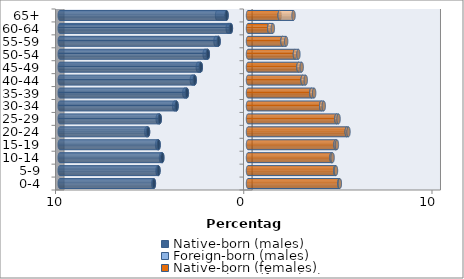
| Category | Native-born (males) | Foreign-born (males) | Native-born (females) | Foreign-born (females) |
|---|---|---|---|---|
| 0-4 | -4.999 | -0.032 | 4.853 | 0.024 |
| 5-9 | -4.756 | -0.05 | 4.635 | 0.04 |
| 10-14 | -4.552 | -0.067 | 4.437 | 0.057 |
| 15-19 | -4.749 | -0.079 | 4.65 | 0.072 |
| 20-24 | -5.31 | -0.092 | 5.247 | 0.091 |
| 25-29 | -4.687 | -0.108 | 4.698 | 0.113 |
| 30-34 | -3.796 | -0.126 | 3.891 | 0.133 |
| 35-39 | -3.246 | -0.137 | 3.367 | 0.147 |
| 40-44 | -2.831 | -0.152 | 2.904 | 0.164 |
| 45-49 | -2.508 | -0.158 | 2.68 | 0.172 |
| 50-54 | -2.135 | -0.167 | 2.494 | 0.184 |
| 55-59 | -1.562 | -0.165 | 1.833 | 0.193 |
| 60-64 | -0.909 | -0.167 | 1.13 | 0.19 |
| 65+ | -1.139 | -0.503 | 1.683 | 0.736 |